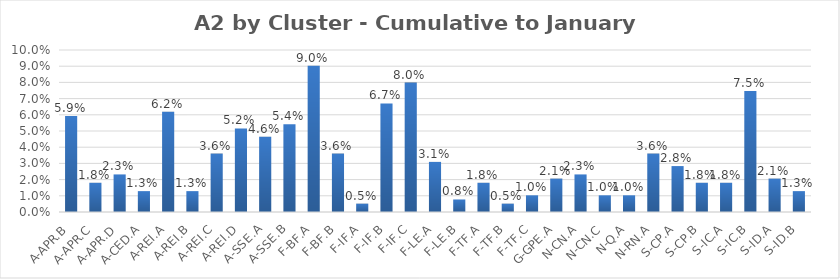
| Category | Series 0 |
|---|---|
| A-APR.B | 0.059 |
| A-APR.C | 0.018 |
| A-APR.D | 0.023 |
| A-CED.A | 0.013 |
| A-REI.A | 0.062 |
| A-REI.B | 0.013 |
| A-REI.C | 0.036 |
| A-REI.D | 0.052 |
| A-SSE.A | 0.046 |
| A-SSE.B | 0.054 |
| F-BF.A | 0.09 |
| F-BF.B | 0.036 |
| F-IF.A | 0.005 |
| F-IF.B | 0.067 |
| F-IF.C | 0.08 |
| F-LE.A | 0.031 |
| F-LE.B | 0.008 |
| F-TF.A | 0.018 |
| F-TF.B | 0.005 |
| F-TF.C | 0.01 |
| G-GPE.A | 0.021 |
| N-CN.A | 0.023 |
| N-CN.C | 0.01 |
| N-Q.A | 0.01 |
| N-RN.A | 0.036 |
| S-CP.A | 0.028 |
| S-CP.B | 0.018 |
| S-IC.A | 0.018 |
| S-IC.B | 0.075 |
| S-ID.A | 0.021 |
| S-ID.B | 0.013 |